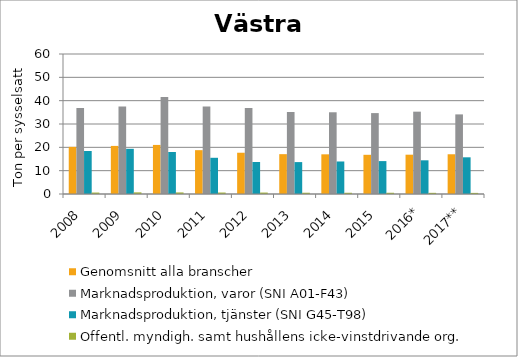
| Category | Genomsnitt alla branscher | Marknadsproduktion, varor (SNI A01-F43) | Marknadsproduktion, tjänster (SNI G45-T98) | Offentl. myndigh. samt hushållens icke-vinstdrivande org. |
|---|---|---|---|---|
| 2008 | 20.202 | 36.833 | 18.44 | 0.622 |
| 2009 | 20.607 | 37.503 | 19.365 | 0.703 |
| 2010 | 21.03 | 41.527 | 18.001 | 0.67 |
| 2011 | 18.786 | 37.472 | 15.519 | 0.627 |
| 2012 | 17.686 | 36.85 | 13.726 | 0.616 |
| 2013 | 17.076 | 35.14 | 13.675 | 0.543 |
| 2014 | 17.006 | 35.026 | 13.936 | 0.527 |
| 2015 | 16.8 | 34.674 | 14.102 | 0.529 |
| 2016* | 16.844 | 35.286 | 14.439 | 0.496 |
| 2017** | 17.032 | 34.117 | 15.725 | 0.475 |